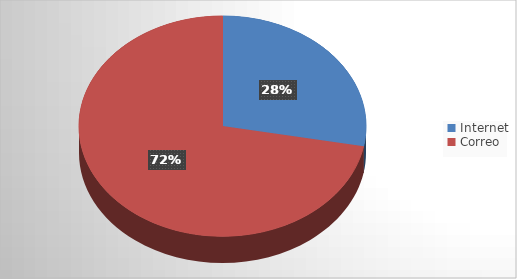
| Category | Series 0 |
|---|---|
| Internet | 19 |
| Correo | 49 |